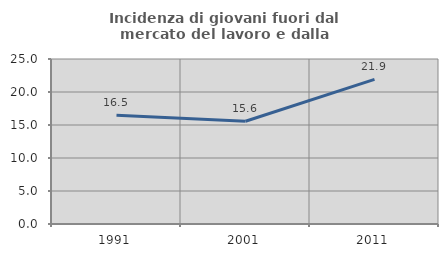
| Category | Incidenza di giovani fuori dal mercato del lavoro e dalla formazione  |
|---|---|
| 1991.0 | 16.478 |
| 2001.0 | 15.565 |
| 2011.0 | 21.92 |